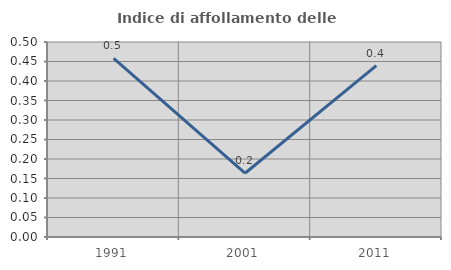
| Category | Indice di affollamento delle abitazioni  |
|---|---|
| 1991.0 | 0.458 |
| 2001.0 | 0.163 |
| 2011.0 | 0.439 |